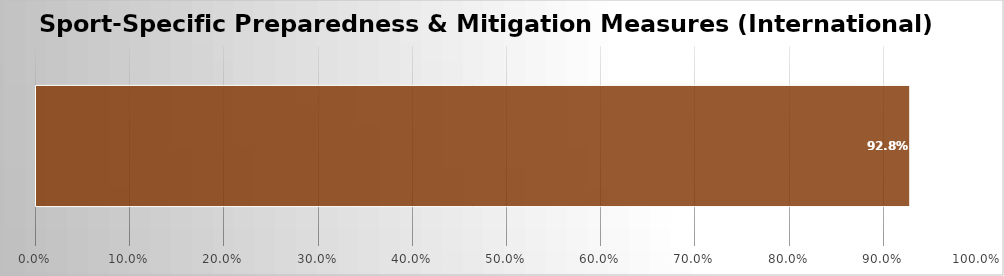
| Category | Specific Mitigation Measures |
|---|---|
| 0 | 0.928 |